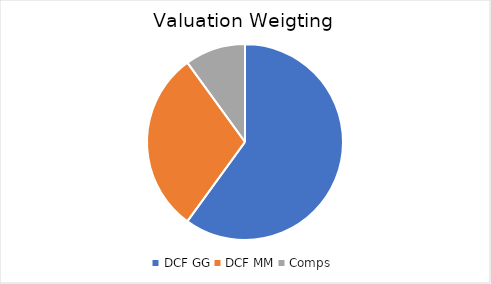
| Category | Series 0 |
|---|---|
| DCF GG | 0.6 |
| DCF MM | 0.3 |
| Comps | 0.1 |